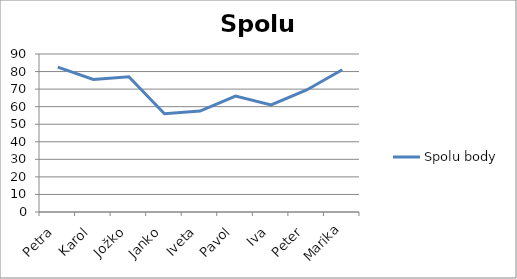
| Category | Spolu body |
|---|---|
| Petra | 82.5 |
| Karol | 75.5 |
| Jožko | 77 |
| Janko | 56 |
| Iveta | 57.5 |
| Pavol | 66 |
| Iva | 61 |
| Peter | 69.5 |
| Marika | 81 |